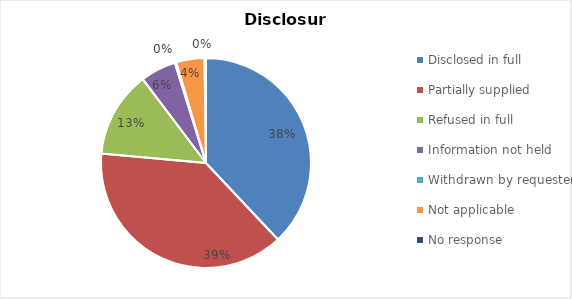
| Category | Series 0 |
|---|---|
| Disclosed in full | 166 |
| Partially supplied | 168 |
| Refused in full | 58 |
| Information not held | 24 |
| Withdrawn by requester | 1 |
| Not applicable | 19 |
| No response | 1 |